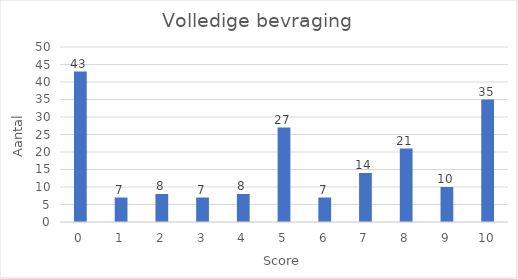
| Category | Aantal |
|---|---|
| 0.0 | 43 |
| 1.0 | 7 |
| 2.0 | 8 |
| 3.0 | 7 |
| 4.0 | 8 |
| 5.0 | 27 |
| 6.0 | 7 |
| 7.0 | 14 |
| 8.0 | 21 |
| 9.0 | 10 |
| 10.0 | 35 |